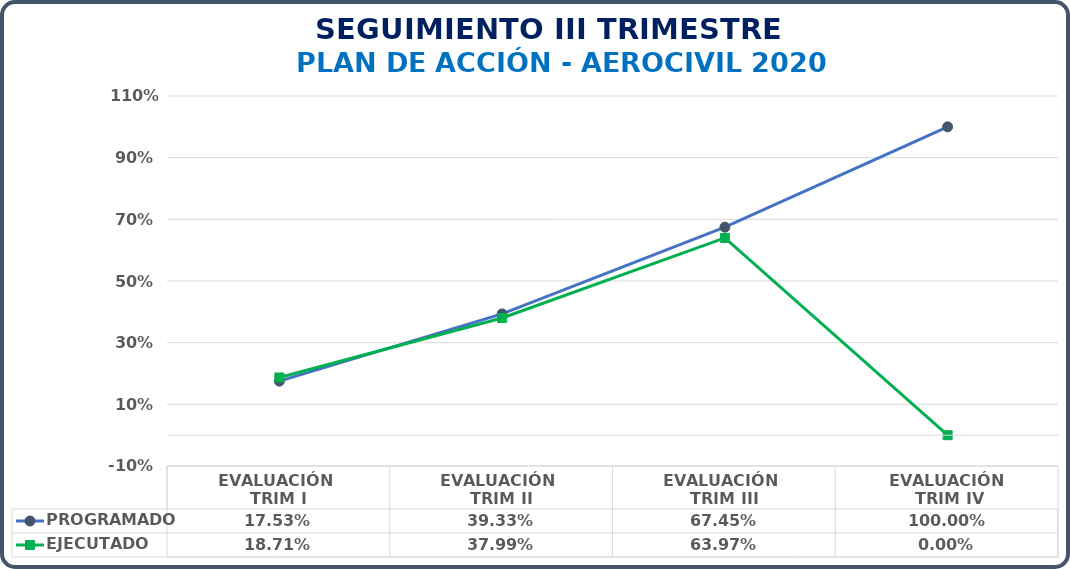
| Category | PROGRAMADO | EJECUTADO |
|---|---|---|
| EVALUACIÓN 
TRIM I | 0.175 | 0.187 |
| EVALUACIÓN 
TRIM II | 0.393 | 0.38 |
| EVALUACIÓN 
TRIM III | 0.674 | 0.64 |
| EVALUACIÓN
 TRIM IV | 1 | 0 |